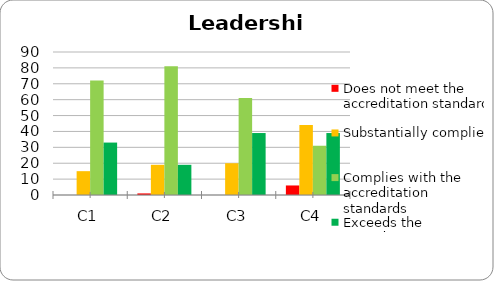
| Category | Does not meet the accreditation standard | Substantially complies | Complies with the accreditation standards | Exceeds the accreditation standards |
|---|---|---|---|---|
| C1 | 0 | 15 | 72 | 33 |
| C2 | 1 | 19 | 81 | 19 |
| C3 | 0 | 20 | 61 | 39 |
| C4 | 6 | 44 | 31 | 39 |